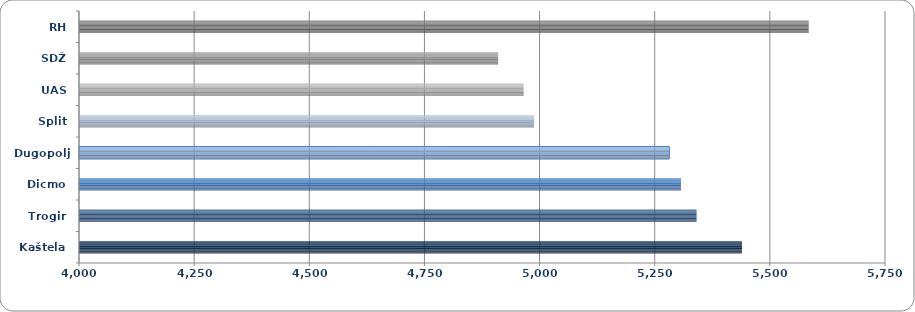
| Category | Prosječna mjesečna neto plaća |
|---|---|
| Kaštela | 5439.449 |
| Trogir | 5340.795 |
| Dicmo | 5307.015 |
| Dugopolje | 5281.735 |
| Split | 4987.917 |
| UAS | 4965.372 |
| SDŽ | 4910.082 |
| RH | 5584.326 |